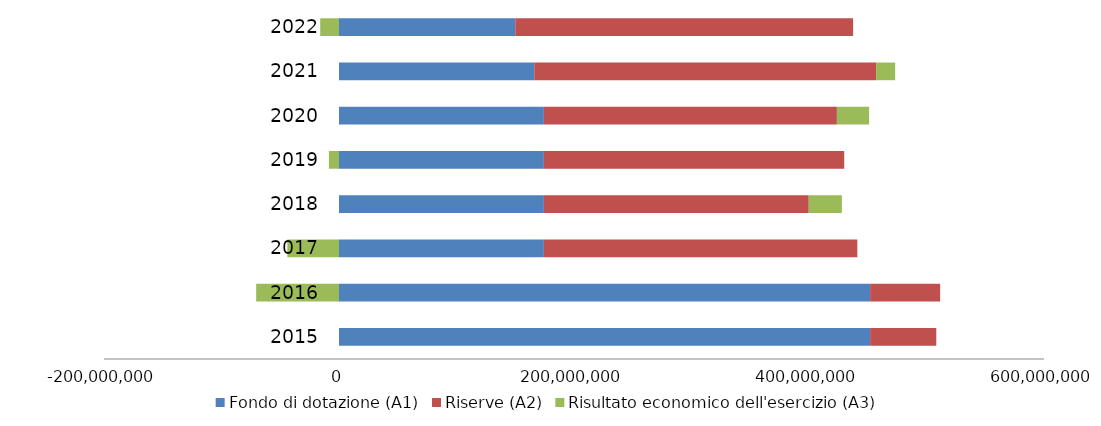
| Category | Fondo di dotazione (A1) | Riserve (A2) | Risultato economico dell'esercizio (A3) |
|---|---|---|---|
| 2015.0 | 452006522.87 | 56341673.46 | 0 |
| 2016.0 | 452006522.87 | 59608547.5 | -70480822.15 |
| 2017.0 | 174378812.36 | 266755435.86 | -43968756.27 |
| 2018.0 | 174378812.36 | 225419010.52 | 28185064.61 |
| 2019.0 | 174378812.36 | 255603078.13 | -8585004.66 |
| 2020.0 | 174378812.36 | 249360634.73 | 27412278.6 |
| 2021.0 | 166150910.95 | 290936715.13 | 16275424.44 |
| 2022.0 | 150015865 | 287515091.15 | -15994728.1 |